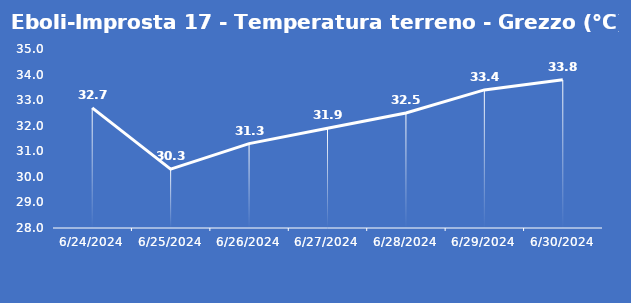
| Category | Eboli-Improsta 17 - Temperatura terreno - Grezzo (°C) |
|---|---|
| 6/24/24 | 32.7 |
| 6/25/24 | 30.3 |
| 6/26/24 | 31.3 |
| 6/27/24 | 31.9 |
| 6/28/24 | 32.5 |
| 6/29/24 | 33.4 |
| 6/30/24 | 33.8 |